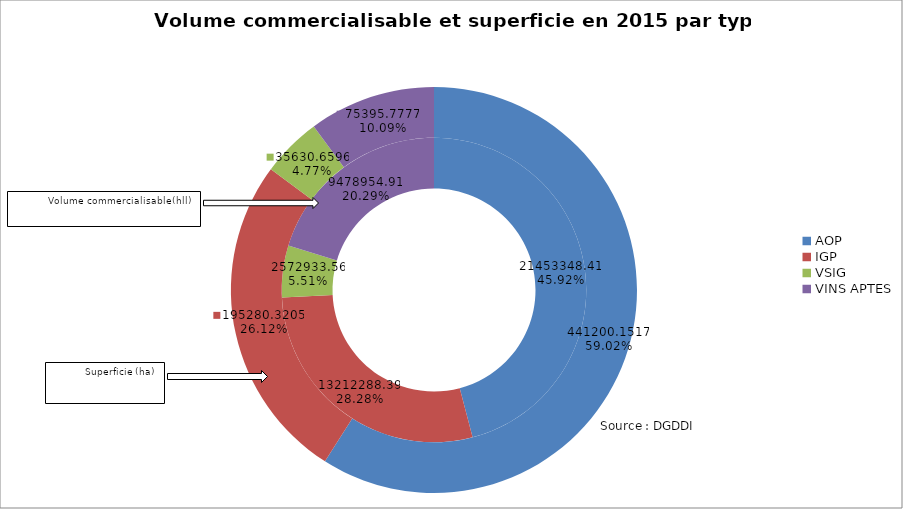
| Category | Superficie (en ha) | Volume commercialisable (hl) |
|---|---|---|
| AOP | 21453348.41 | 441200.152 |
| IGP | 13212288.39 | 195280.32 |
| VSIG | 2572933.56 | 35630.66 |
| VINS APTES | 9478954.91 | 75395.778 |